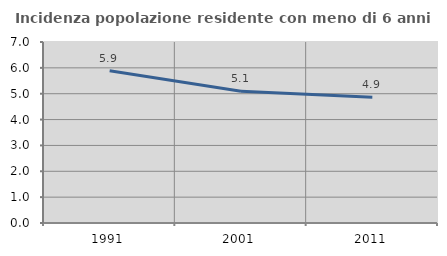
| Category | Incidenza popolazione residente con meno di 6 anni |
|---|---|
| 1991.0 | 5.886 |
| 2001.0 | 5.099 |
| 2011.0 | 4.867 |